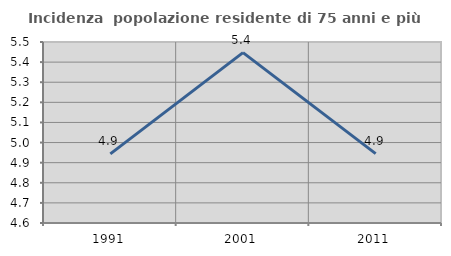
| Category | Incidenza  popolazione residente di 75 anni e più |
|---|---|
| 1991.0 | 4.944 |
| 2001.0 | 5.447 |
| 2011.0 | 4.945 |